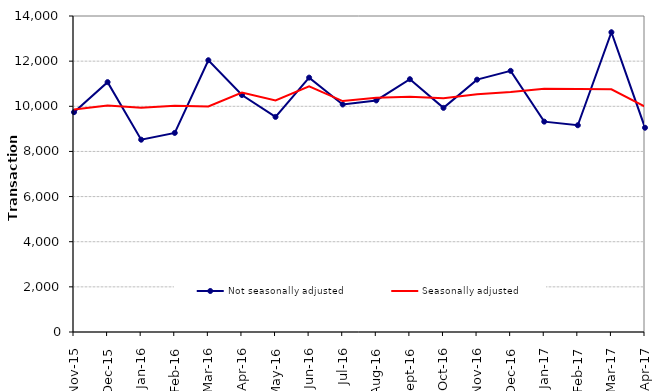
| Category | Not seasonally adjusted | Seasonally adjusted |
|---|---|---|
| 2015-11-01 | 9740 | 9860 |
| 2015-12-01 | 11070 | 10040 |
| 2016-01-01 | 8520 | 9940 |
| 2016-02-01 | 8820 | 10020 |
| 2016-03-01 | 12040 | 9990 |
| 2016-04-01 | 10500 | 10610 |
| 2016-05-01 | 9530 | 10260 |
| 2016-06-01 | 11270 | 10880 |
| 2016-07-01 | 10080 | 10230 |
| 2016-08-01 | 10260 | 10380 |
| 2016-09-01 | 11200 | 10420 |
| 2016-10-01 | 9930 | 10360 |
| 2016-11-01 | 11180 | 10530 |
| 2016-12-01 | 11570 | 10630 |
| 2017-01-01 | 9320 | 10780 |
| 2017-02-01 | 9160 | 10770 |
| 2017-03-01 | 13280 | 10750 |
| 2017-04-01 | 9050 | 9980 |